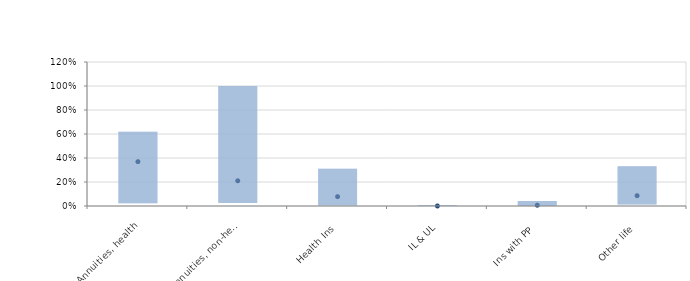
| Category | 25% | 50% | 75% |
|---|---|---|---|
| Annuities, health | 0.023 | 0.37 | 0.619 |
| Annuities, non-health | 0.026 | 0.21 | 1 |
| Health Ins | 0.004 | 0.078 | 0.31 |
| IL & UL | 0 | 0 | 0.006 |
| Ins with PP | 0 | 0.007 | 0.042 |
| Other life | 0.012 | 0.086 | 0.331 |